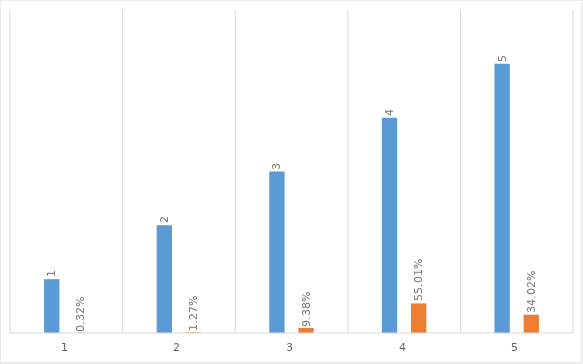
| Category | Series 0 | Series 1 |
|---|---|---|
| 0 | 1 | 0.003 |
| 1 | 2 | 0.013 |
| 2 | 3 | 0.094 |
| 3 | 4 | 0.55 |
| 4 | 5 | 0.34 |